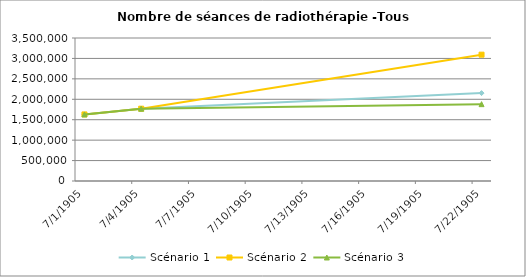
| Category | Scénario 1 | Scénario 2 | Scénario 3 |
|---|---|---|---|
| 2009.0 | 1629234 | 1629234 | 1629234 |
| 2012.0 | 1769598 | 1769598 | 1769598 |
| 2030.0 | 2151445.874 | 3091973.306 | 1881048.825 |